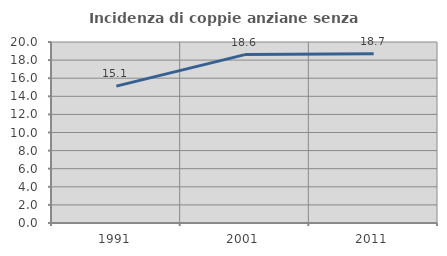
| Category | Incidenza di coppie anziane senza figli  |
|---|---|
| 1991.0 | 15.127 |
| 2001.0 | 18.609 |
| 2011.0 | 18.698 |